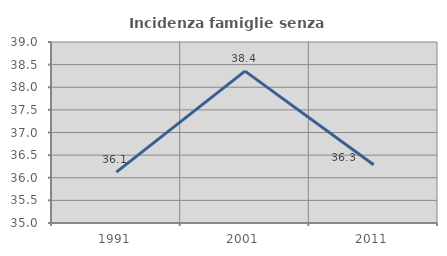
| Category | Incidenza famiglie senza nuclei |
|---|---|
| 1991.0 | 36.126 |
| 2001.0 | 38.356 |
| 2011.0 | 36.287 |